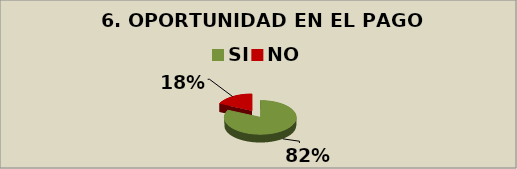
| Category | Series 0 |
|---|---|
| SI | 0.82 |
| NO | 0.18 |